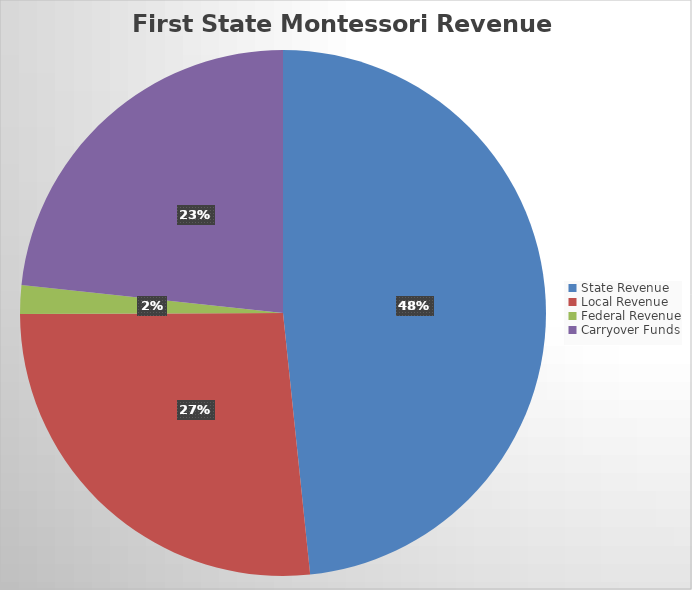
| Category | Series 0 |
|---|---|
| State Revenue | 6536684.25 |
| Local Revenue | 3593185.13 |
| Federal Revenue | 237928.68 |
| Carryover Funds | 3150705.38 |